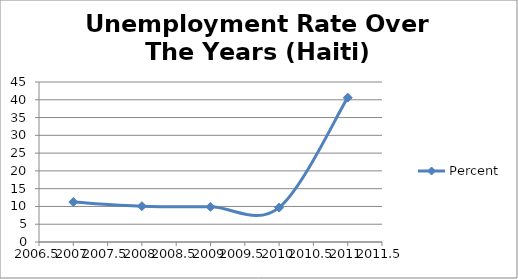
| Category | Percent |
|---|---|
| 2007.0 | 11.24 |
| 2008.0 | 10.08 |
| 2009.0 | 9.88 |
| 2010.0 | 9.67 |
| 2011.0 | 40.6 |